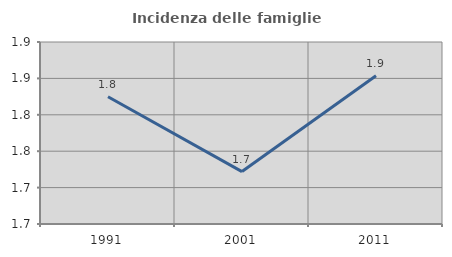
| Category | Incidenza delle famiglie numerose |
|---|---|
| 1991.0 | 1.825 |
| 2001.0 | 1.722 |
| 2011.0 | 1.854 |